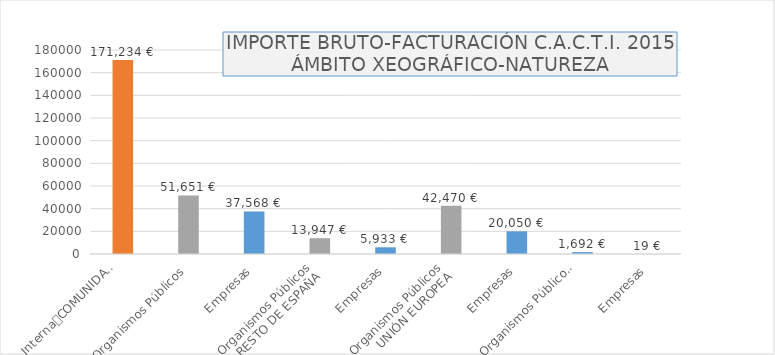
| Category | Series 0 |
|---|---|
| 0 | 171234.07 |
| 1 | 51650.7 |
| 2 | 37567.87 |
| 3 | 13947.2 |
| 4 | 5933 |
| 5 | 42470.2 |
| 6 | 20050.35 |
| 7 | 1692 |
| 8 | 18.5 |